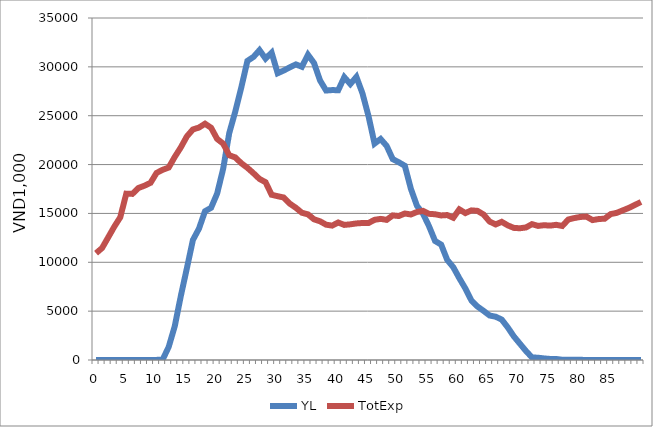
| Category | YL | TotExp |
|---|---|---|
| 0.0 | 0 | 10929.642 |
| 1.0 | 0 | 11459.111 |
| 2.0 | 0 | 12539.925 |
| 3.0 | 0 | 13628.098 |
| 4.0 | 0 | 14605.066 |
| 5.0 | 0 | 17023.119 |
| 6.0 | 0 | 16999.341 |
| 7.0 | 0 | 17601.003 |
| 8.0 | 0.387 | 17836.508 |
| 9.0 | 6.276 | 18132.183 |
| 10.0 | 11.718 | 19146.31 |
| 11.0 | 32.328 | 19464.499 |
| 12.0 | 1336.711 | 19694.466 |
| 13.0 | 3449.143 | 20780.515 |
| 14.0 | 6537.999 | 21753.285 |
| 15.0 | 9377.575 | 22879.117 |
| 16.0 | 12279.932 | 23593.82 |
| 17.0 | 13445.3 | 23788.649 |
| 18.0 | 15225.707 | 24180.173 |
| 19.0 | 15575.963 | 23768.761 |
| 20.0 | 17030.088 | 22625.611 |
| 21.0 | 19576.156 | 22144.098 |
| 22.0 | 23217.224 | 20953.296 |
| 23.0 | 25432.583 | 20732.552 |
| 24.0 | 27911.764 | 20132.395 |
| 25.0 | 30608.927 | 19669.34 |
| 26.0 | 31014.513 | 19115.609 |
| 27.0 | 31711.207 | 18529.039 |
| 28.0 | 30842.395 | 18194.88 |
| 29.0 | 31452.982 | 16907.504 |
| 30.0 | 29345.521 | 16762.33 |
| 31.0 | 29627.223 | 16630.944 |
| 32.0 | 29947.603 | 16001.055 |
| 33.0 | 30251.955 | 15579.529 |
| 34.0 | 30007.145 | 15068.822 |
| 35.0 | 31242.649 | 14905.387 |
| 36.0 | 30394.772 | 14399.106 |
| 37.0 | 28603.299 | 14194.577 |
| 38.0 | 27578.964 | 13848.043 |
| 39.0 | 27623.463 | 13752.976 |
| 40.0 | 27610.798 | 14070.309 |
| 41.0 | 28942.04 | 13825.096 |
| 42.0 | 28241.429 | 13885.166 |
| 43.0 | 28970.799 | 13977.273 |
| 44.0 | 27295.012 | 14019.656 |
| 45.0 | 24964.228 | 14019.337 |
| 46.0 | 22145.565 | 14347.093 |
| 47.0 | 22617.368 | 14442.2 |
| 48.0 | 21908.912 | 14341.977 |
| 49.0 | 20560.867 | 14796.853 |
| 50.0 | 20235.464 | 14735.927 |
| 51.0 | 19876.506 | 14992.659 |
| 52.0 | 17520.052 | 14892.337 |
| 53.0 | 15784.881 | 15148.209 |
| 54.0 | 14980.37 | 15262.71 |
| 55.0 | 13685.876 | 14958.37 |
| 56.0 | 12175.749 | 14917.225 |
| 57.0 | 11809.736 | 14793.676 |
| 58.0 | 10242.844 | 14834.475 |
| 59.0 | 9498.558 | 14555.38 |
| 60.0 | 8369.871 | 15415.778 |
| 61.0 | 7316.549 | 15035.173 |
| 62.0 | 6088.488 | 15312.41 |
| 63.0 | 5474.221 | 15262.588 |
| 64.0 | 5030.291 | 14891.11 |
| 65.0 | 4555.751 | 14169.685 |
| 66.0 | 4430.019 | 13874.322 |
| 67.0 | 4139.279 | 14138.905 |
| 68.0 | 3335.926 | 13779.141 |
| 69.0 | 2419.545 | 13520.159 |
| 70.0 | 1671.646 | 13481.662 |
| 71.0 | 924.43 | 13563.42 |
| 72.0 | 264.097 | 13903.169 |
| 73.0 | 233.183 | 13723.558 |
| 74.0 | 160.66 | 13794.974 |
| 75.0 | 108.981 | 13753.47 |
| 76.0 | 104.741 | 13834.357 |
| 77.0 | 24.074 | 13716.032 |
| 78.0 | 20.746 | 14375.956 |
| 79.0 | 21.027 | 14528.726 |
| 80.0 | 19.263 | 14641.018 |
| 81.0 | 0.726 | 14673.146 |
| 82.0 | 0 | 14317.55 |
| 83.0 | 0 | 14423.715 |
| 84.0 | 0 | 14461.966 |
| 85.0 | 0 | 14930.575 |
| 86.0 | 0 | 15059.186 |
| 87.0 | 0 | 15314.131 |
| 88.0 | 0 | 15565.361 |
| 89.0 | 0 | 15868.912 |